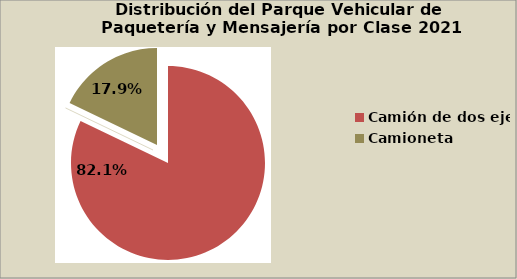
| Category | Series 0 |
|---|---|
| Camión de dos ejes | 82.117 |
| Camión de tres ejes | 0.019 |
| Camioneta | 17.864 |